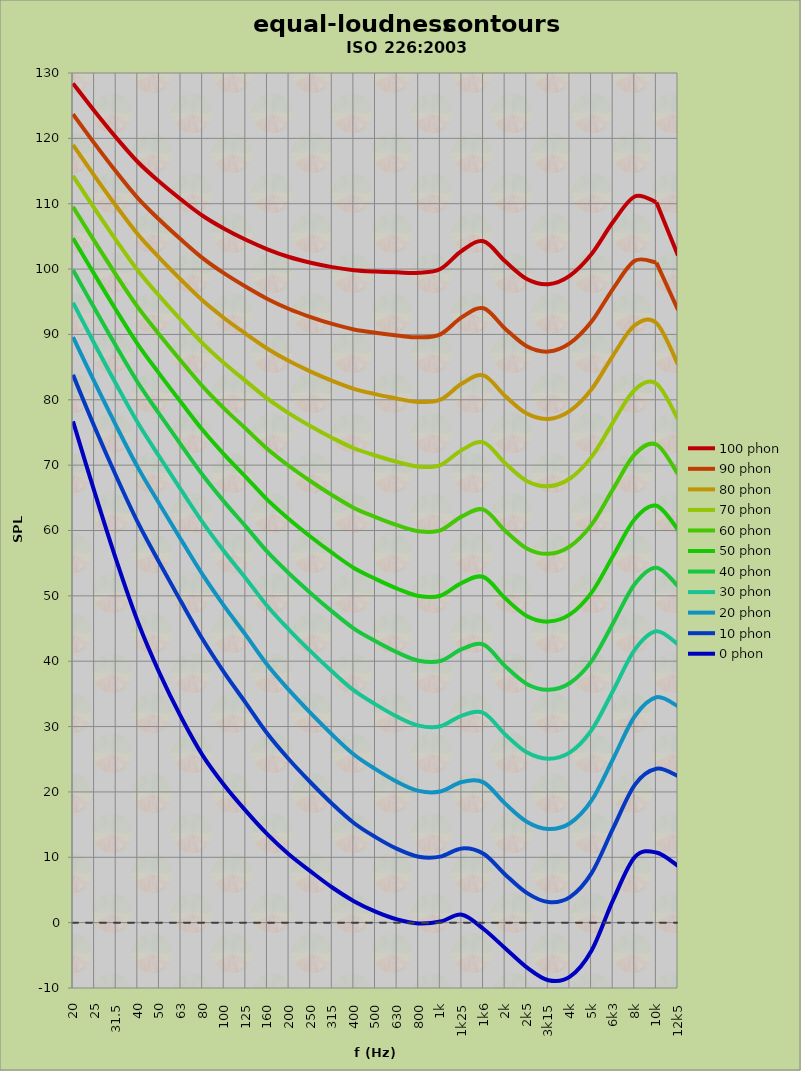
| Category | 100 phon | 90 phon | 80 phon | 70 phon | 60 phon | 50 phon | 40 phon | 30 phon | 20 phon | 10 phon | 0 phon |
|---|---|---|---|---|---|---|---|---|---|---|---|
| 20 | 128.414 | 123.706 | 118.991 | 114.263 | 109.514 | 104.725 | 99.862 | 94.865 | 89.608 | 83.811 | 76.699 |
| 25 | 124.153 | 119.199 | 114.234 | 109.249 | 104.231 | 99.15 | 93.954 | 88.539 | 82.685 | 75.834 | 65.864 |
| 31,5 | 120.11 | 114.885 | 109.647 | 104.385 | 99.081 | 93.7 | 88.176 | 82.377 | 76.014 | 68.297 | 55.493 |
| 40 | 116.379 | 110.866 | 105.338 | 99.783 | 94.18 | 88.491 | 82.639 | 76.474 | 69.658 | 61.235 | 46.027 |
| 50 | 113.353 | 107.546 | 101.722 | 95.87 | 89.967 | 83.969 | 77.796 | 71.283 | 64.061 | 55.069 | 38.21 |
| 63 | 110.648 | 104.514 | 98.363 | 92.182 | 85.947 | 79.613 | 73.094 | 66.219 | 58.597 | 49.121 | 31.465 |
| 80 | 108.156 | 101.673 | 95.174 | 88.644 | 82.057 | 75.368 | 68.49 | 61.245 | 53.237 | 43.353 | 25.596 |
| 100 | 106.167 | 99.333 | 92.481 | 85.598 | 78.658 | 71.616 | 64.384 | 56.785 | 48.43 | 38.251 | 21.021 |
| 125 | 104.478 | 97.293 | 90.09 | 82.857 | 75.567 | 68.177 | 60.599 | 52.662 | 43.992 | 33.595 | 17.096 |
| 160 | 103.028 | 95.431 | 87.817 | 80.175 | 72.479 | 64.686 | 56.716 | 48.409 | 39.423 | 28.891 | 13.497 |
| 200 | 101.846 | 93.89 | 85.918 | 77.918 | 69.869 | 61.729 | 53.423 | 44.805 | 35.566 | 24.958 | 10.424 |
| 250 | 100.971 | 92.647 | 84.309 | 75.947 | 67.539 | 59.051 | 50.414 | 41.501 | 32.047 | 21.441 | 7.837 |
| 315 | 100.299 | 91.603 | 82.895 | 74.165 | 65.397 | 56.558 | 47.593 | 38.393 | 28.742 | 18.163 | 5.375 |
| 400 | 99.83 | 90.76 | 81.68 | 72.583 | 63.456 | 54.274 | 44.993 | 35.53 | 25.726 | 15.246 | 3.291 |
| 500 | 99.618 | 90.245 | 80.865 | 71.472 | 62.056 | 52.599 | 43.067 | 33.4 | 23.482 | 13.082 | 1.696 |
| 630 | 99.496 | 89.838 | 80.175 | 70.505 | 60.82 | 51.111 | 41.356 | 31.521 | 21.538 | 11.282 | 0.498 |
| 800 | 99.439 | 89.555 | 79.671 | 69.784 | 59.892 | 49.993 | 40.079 | 30.14 | 20.156 | 10.091 | -0.122 |
| 1k | 100.013 | 90.013 | 80.014 | 70.015 | 60.017 | 50.021 | 40.027 | 30.039 | 20.06 | 10.097 | 0.163 |
| 1k25 | 102.81 | 92.648 | 82.485 | 72.323 | 62.16 | 51.999 | 41.837 | 31.677 | 21.518 | 11.362 | 1.211 |
| 1k6 | 104.252 | 94 | 83.743 | 73.477 | 63.195 | 52.885 | 42.526 | 32.075 | 21.46 | 10.538 | -0.977 |
| 2k | 101.179 | 90.886 | 80.589 | 70.284 | 59.967 | 49.628 | 39.248 | 28.795 | 18.21 | 7.382 | -3.908 |
| 2k5 | 98.478 | 88.185 | 77.886 | 67.581 | 57.261 | 46.916 | 36.527 | 26.058 | 15.443 | 4.559 | -6.84 |
| 3k15 | 97.675 | 87.379 | 77.077 | 66.763 | 56.43 | 46.06 | 35.627 | 25.078 | 14.316 | 3.153 | -8.806 |
| 4k | 99 | 88.66 | 78.314 | 67.956 | 57.576 | 47.157 | 36.667 | 26.052 | 15.202 | 3.91 | -8.269 |
| 5k | 102.302 | 91.964 | 81.62 | 71.266 | 60.894 | 50.489 | 40.026 | 29.457 | 18.695 | 7.57 | -4.266 |
| 6k3 | 107.23 | 97.022 | 86.81 | 76.594 | 66.367 | 56.122 | 45.846 | 35.513 | 25.077 | 14.454 | 3.478 |
| 8k | 111.11 | 101.261 | 91.408 | 81.546 | 71.669 | 61.766 | 51.814 | 41.776 | 31.579 | 21.089 | 10.03 |
| 10k | 110.228 | 100.988 | 91.738 | 82.467 | 73.16 | 63.789 | 54.301 | 44.597 | 34.483 | 23.544 | 10.73 |
| 12k5 | 102.07 | 93.746 | 85.408 | 77.045 | 68.635 | 60.144 | 51.501 | 42.576 | 33.099 | 22.441 | 8.68 |